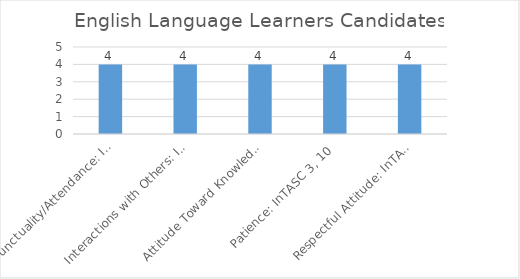
| Category | Series 0 |
|---|---|
| Punctuality/Attendance: InTASC 1, 9 | 4 |
| Interactions with Others: InTASC 3, 7, 10 | 4 |
| Attitude Toward Knowledge and Learning: InTASC 1, 4, 5, 9, 10 | 4 |
| Patience: InTASC 3, 10 | 4 |
| Respectful Attitude: InTASC 3, 7, 10 | 4 |